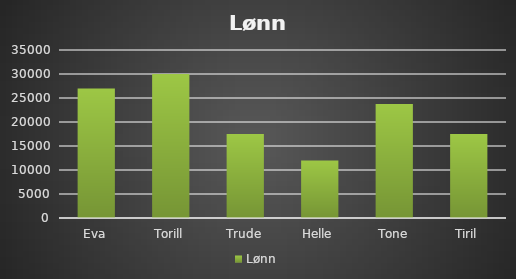
| Category | Lønn |
|---|---|
| Eva | 27000 |
| Torill | 30000 |
| Trude | 17500 |
| Helle | 12000 |
| Tone | 23750 |
| Tiril | 17500 |